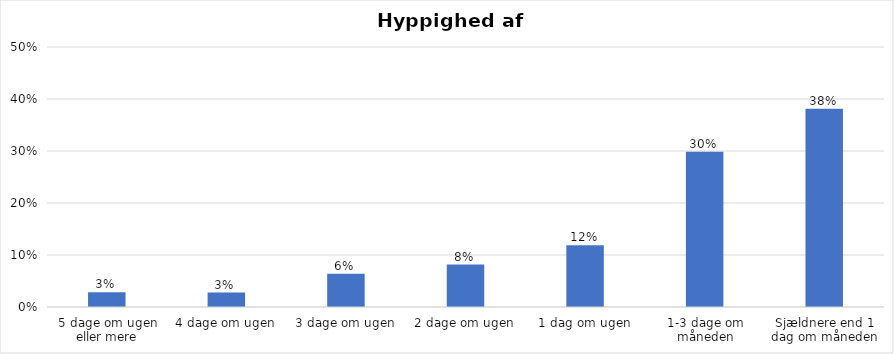
| Category | % |
|---|---|
| 5 dage om ugen eller mere | 0.028 |
| 4 dage om ugen | 0.028 |
| 3 dage om ugen | 0.064 |
| 2 dage om ugen | 0.082 |
| 1 dag om ugen | 0.119 |
| 1-3 dage om måneden | 0.298 |
| Sjældnere end 1 dag om måneden | 0.381 |